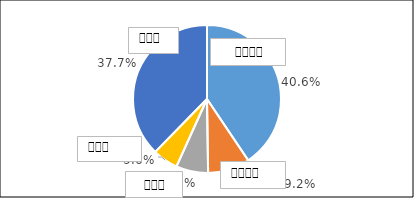
| Category | Series 0 |
|---|---|
| 0 | 0.406 |
| 1 | 0.092 |
| 2 | 0.07 |
| 3 | 0.056 |
| 4 | 0.377 |